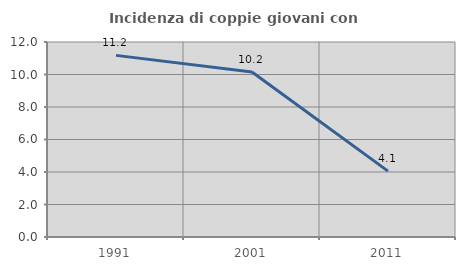
| Category | Incidenza di coppie giovani con figli |
|---|---|
| 1991.0 | 11.176 |
| 2001.0 | 10.154 |
| 2011.0 | 4.054 |